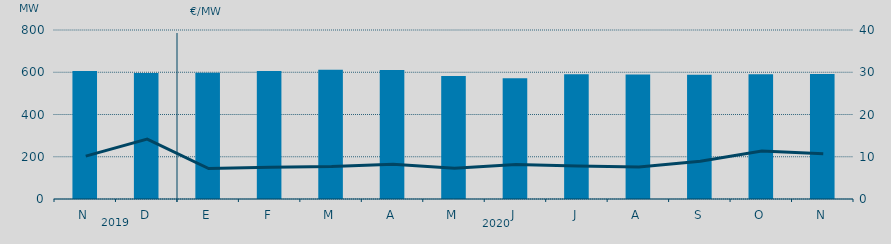
| Category | Energia (MWh) a subir |
|---|---|
| N | 605.422 |
| D | 596.999 |
| E | 597.488 |
| F | 605.632 |
| M | 611.351 |
| A | 610.483 |
| M | 582.745 |
| J | 571.897 |
| J | 590.058 |
| A | 589.661 |
| S | 587.738 |
| O | 590.796 |
| N | 591.888 |